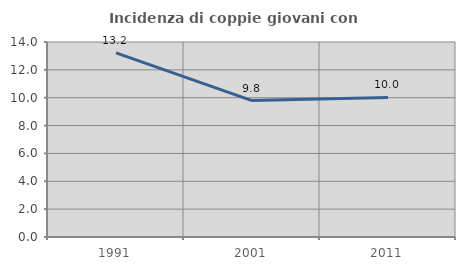
| Category | Incidenza di coppie giovani con figli |
|---|---|
| 1991.0 | 13.224 |
| 2001.0 | 9.795 |
| 2011.0 | 10.018 |